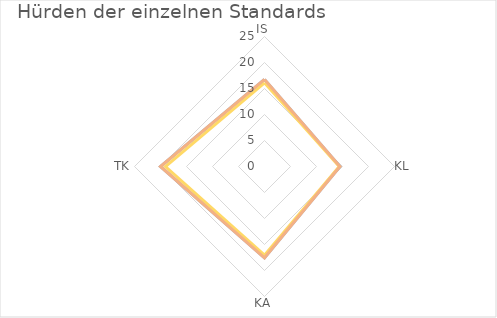
| Category | Series 0 | Series 1 | Series 2 |
|---|---|---|---|
| IS | 16.75 | 16.1 | 16.75 |
| KL | 14.51 | 14.38 | 14.51 |
| KA | 17.55 | 17.04 | 17.55 |
| TK | 20.01 | 19.05 | 20.01 |